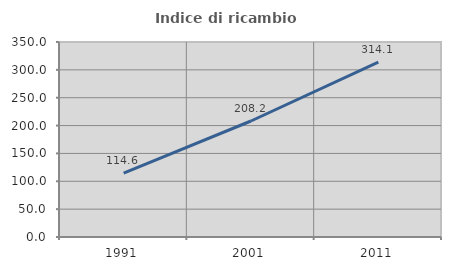
| Category | Indice di ricambio occupazionale  |
|---|---|
| 1991.0 | 114.607 |
| 2001.0 | 208.197 |
| 2011.0 | 314.062 |